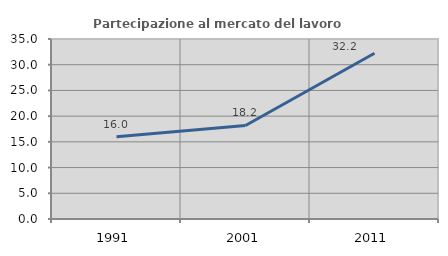
| Category | Partecipazione al mercato del lavoro  femminile |
|---|---|
| 1991.0 | 16 |
| 2001.0 | 18.182 |
| 2011.0 | 32.237 |